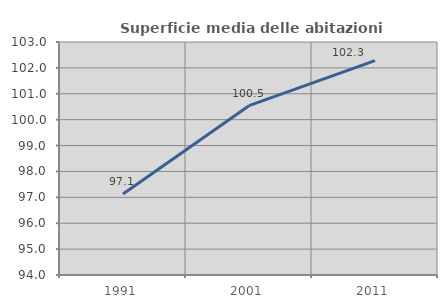
| Category | Superficie media delle abitazioni occupate |
|---|---|
| 1991.0 | 97.13 |
| 2001.0 | 100.54 |
| 2011.0 | 102.281 |